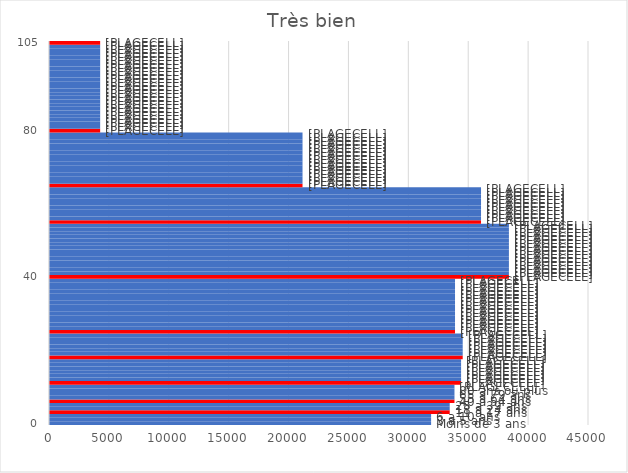
| Category | Series 0 |
|---|---|
| 0.0 | 31817.667 |
| nan | 31817.667 |
| nan | 31817.667 |
| 3.0 | 33371 |
| nan | 33371 |
| nan | 33371 |
| 6.0 | 33768.8 |
| nan | 33768.8 |
| nan | 33768.8 |
| nan | 33768.8 |
| nan | 33768.8 |
| 10.0 | 34320.429 |
| nan | 34320.429 |
| nan | 34320.429 |
| nan | 34320.429 |
| nan | 34320.429 |
| nan | 34320.429 |
| nan | 34320.429 |
| 18.0 | 34456.286 |
| nan | 34456.286 |
| nan | 34456.286 |
| nan | 34456.286 |
| nan | 34456.286 |
| nan | 34456.286 |
| nan | 34456.286 |
| 25.0 | 33813.933 |
| nan | 33813.933 |
| nan | 33813.933 |
| nan | 33813.933 |
| nan | 33813.933 |
| nan | 33813.933 |
| nan | 33813.933 |
| nan | 33813.933 |
| nan | 33813.933 |
| nan | 33813.933 |
| nan | 33813.933 |
| nan | 33813.933 |
| nan | 33813.933 |
| nan | 33813.933 |
| nan | 33813.933 |
| 40.0 | 38314 |
| nan | 38314 |
| nan | 38314 |
| nan | 38314 |
| nan | 38314 |
| nan | 38314 |
| nan | 38314 |
| nan | 38314 |
| nan | 38314 |
| nan | 38314 |
| nan | 38314 |
| nan | 38314 |
| nan | 38314 |
| nan | 38314 |
| nan | 38314 |
| 55.0 | 35985.5 |
| nan | 35985.5 |
| nan | 35985.5 |
| nan | 35985.5 |
| nan | 35985.5 |
| nan | 35985.5 |
| nan | 35985.5 |
| nan | 35985.5 |
| nan | 35985.5 |
| nan | 35985.5 |
| 65.0 | 21082.733 |
| nan | 21082.733 |
| nan | 21082.733 |
| nan | 21082.733 |
| nan | 21082.733 |
| nan | 21082.733 |
| nan | 21082.733 |
| nan | 21082.733 |
| nan | 21082.733 |
| nan | 21082.733 |
| nan | 21082.733 |
| nan | 21082.733 |
| nan | 21082.733 |
| nan | 21082.733 |
| nan | 21082.733 |
| 80.0 | 4187.84 |
| nan | 4187.84 |
| nan | 4187.84 |
| nan | 4187.84 |
| nan | 4187.84 |
| nan | 4187.84 |
| nan | 4187.84 |
| nan | 4187.84 |
| nan | 4187.84 |
| nan | 4187.84 |
| nan | 4187.84 |
| nan | 4187.84 |
| nan | 4187.84 |
| nan | 4187.84 |
| nan | 4187.84 |
| nan | 4187.84 |
| nan | 4187.84 |
| nan | 4187.84 |
| nan | 4187.84 |
| 100.0 | 4187.84 |
| nan | 4187.84 |
| nan | 4187.84 |
| nan | 4187.84 |
| nan | 4187.84 |
| 105.0 | 4187.84 |